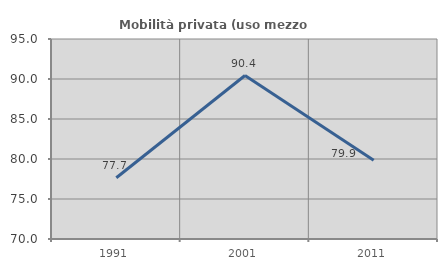
| Category | Mobilità privata (uso mezzo privato) |
|---|---|
| 1991.0 | 77.66 |
| 2001.0 | 90.435 |
| 2011.0 | 79.856 |